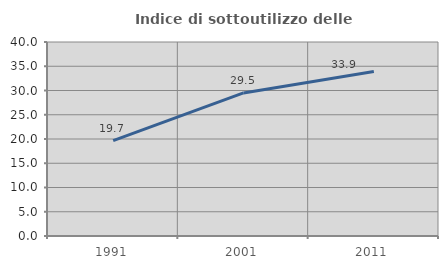
| Category | Indice di sottoutilizzo delle abitazioni  |
|---|---|
| 1991.0 | 19.672 |
| 2001.0 | 29.503 |
| 2011.0 | 33.903 |